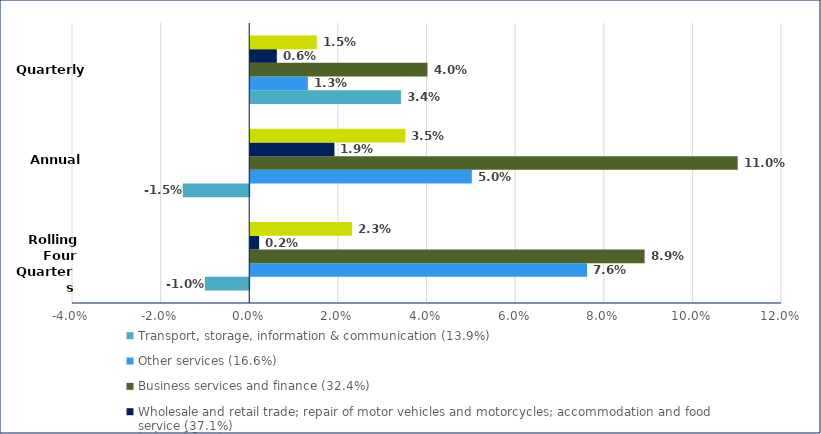
| Category | Transport, storage, information & communication (13.9%) | Other services (16.6%) | Business services and finance (32.4%) | Wholesale and retail trade; repair of motor vehicles and motorcycles; accommodation and food service (37.1%) | Index of Services |
|---|---|---|---|---|---|
|  | -0.01 | 0.076 | 0.089 | 0.002 | 0.023 |
|  | -0.015 | 0.05 | 0.11 | 0.019 | 0.035 |
|  | 0.034 | 0.013 | 0.04 | 0.006 | 0.015 |